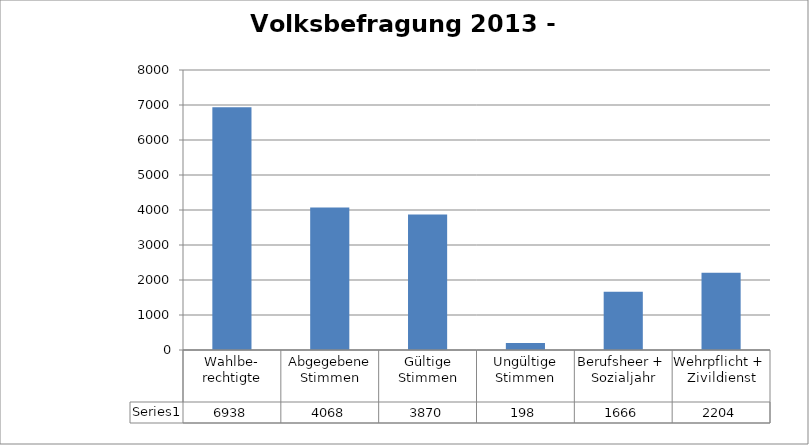
| Category | Series 0 |
|---|---|
| Wahlbe-
rechtigte | 6938 |
| Abgegebene Stimmen | 4068 |
| Gültige Stimmen | 3870 |
| Ungültige Stimmen | 198 |
| Berufsheer + 
Sozialjahr | 1666 |
| Wehrpflicht + 
Zivildienst | 2204 |